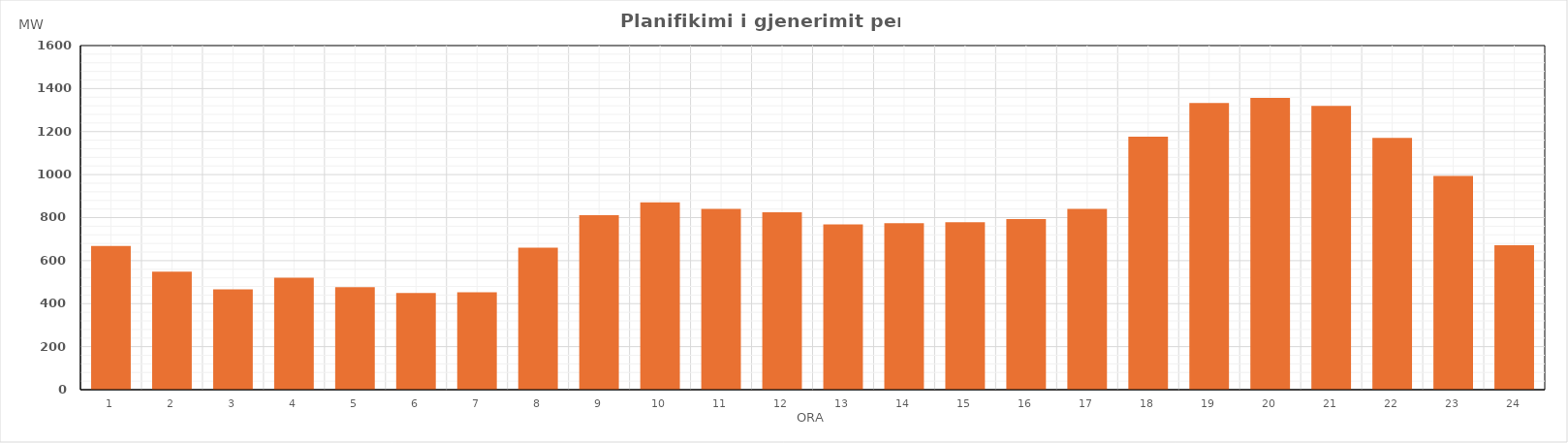
| Category | Max (MW) |
|---|---|
| 0 | 667.78 |
| 1 | 548.47 |
| 2 | 466.21 |
| 3 | 520.44 |
| 4 | 476.99 |
| 5 | 449.25 |
| 6 | 452.97 |
| 7 | 659.8 |
| 8 | 811.83 |
| 9 | 871.46 |
| 10 | 840.99 |
| 11 | 824.24 |
| 12 | 768.4 |
| 13 | 774.52 |
| 14 | 778.33 |
| 15 | 792.99 |
| 16 | 840.6 |
| 17 | 1176.28 |
| 18 | 1333.49 |
| 19 | 1356.68 |
| 20 | 1319.39 |
| 21 | 1170.42 |
| 22 | 994.05 |
| 23 | 671.34 |